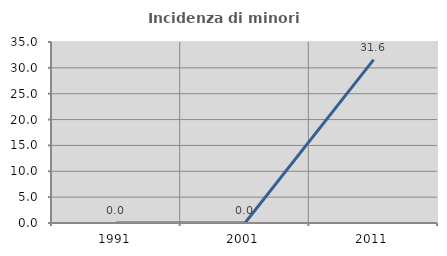
| Category | Incidenza di minori stranieri |
|---|---|
| 1991.0 | 0 |
| 2001.0 | 0 |
| 2011.0 | 31.579 |